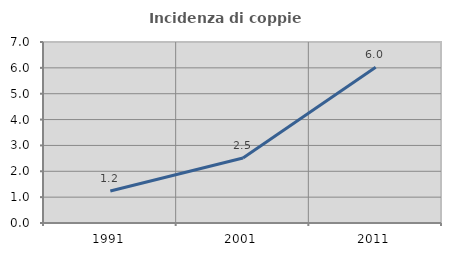
| Category | Incidenza di coppie miste |
|---|---|
| 1991.0 | 1.235 |
| 2001.0 | 2.516 |
| 2011.0 | 6.024 |